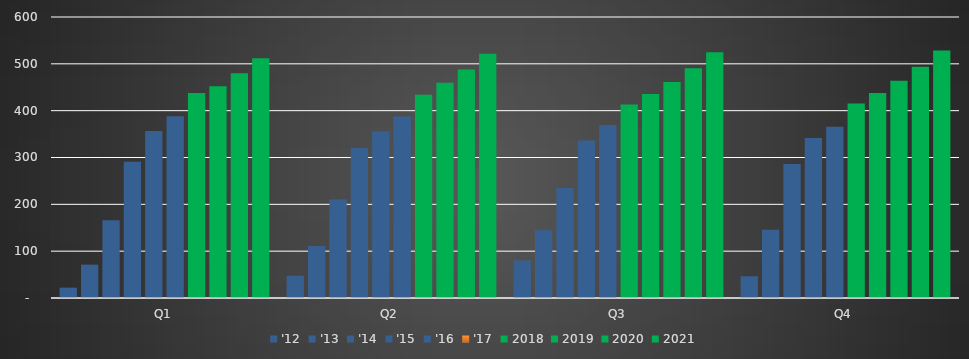
| Category | '12 | '13 | '14 | '15 | '16 | '17 | 2018 | 2019 | 2020 | 2021 |
|---|---|---|---|---|---|---|---|---|---|---|
| Q1 | 22 | 71.22 | 166.14 | 291.06 | 356.37 | 388.28 | 437.897 | 452.129 | 480.043 | 512.137 |
| Q2 | 47.5 | 110.87 | 210.28 | 320.44 | 355.6 | 387.69 | 434.175 | 459.385 | 488.15 | 521.35 |
| Q3 | 80.17 | 144.42 | 234.9 | 336.45 | 369.22 | 413.39 | 435.728 | 461.354 | 490.626 | 524.554 |
| Q4 | 46.44 | 145.75 | 286.07 | 341.43 | 365.61 | 415.239 | 437.93 | 463.999 | 493.825 | 528.498 |